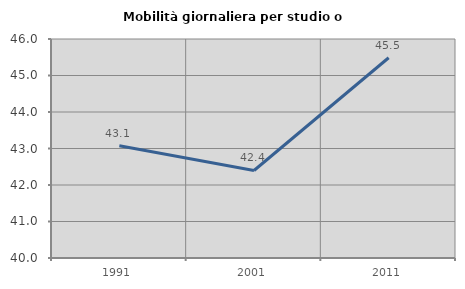
| Category | Mobilità giornaliera per studio o lavoro |
|---|---|
| 1991.0 | 43.074 |
| 2001.0 | 42.398 |
| 2011.0 | 45.486 |